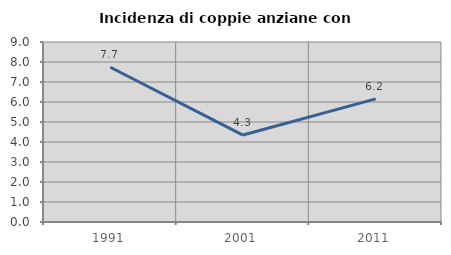
| Category | Incidenza di coppie anziane con figli |
|---|---|
| 1991.0 | 7.736 |
| 2001.0 | 4.348 |
| 2011.0 | 6.158 |